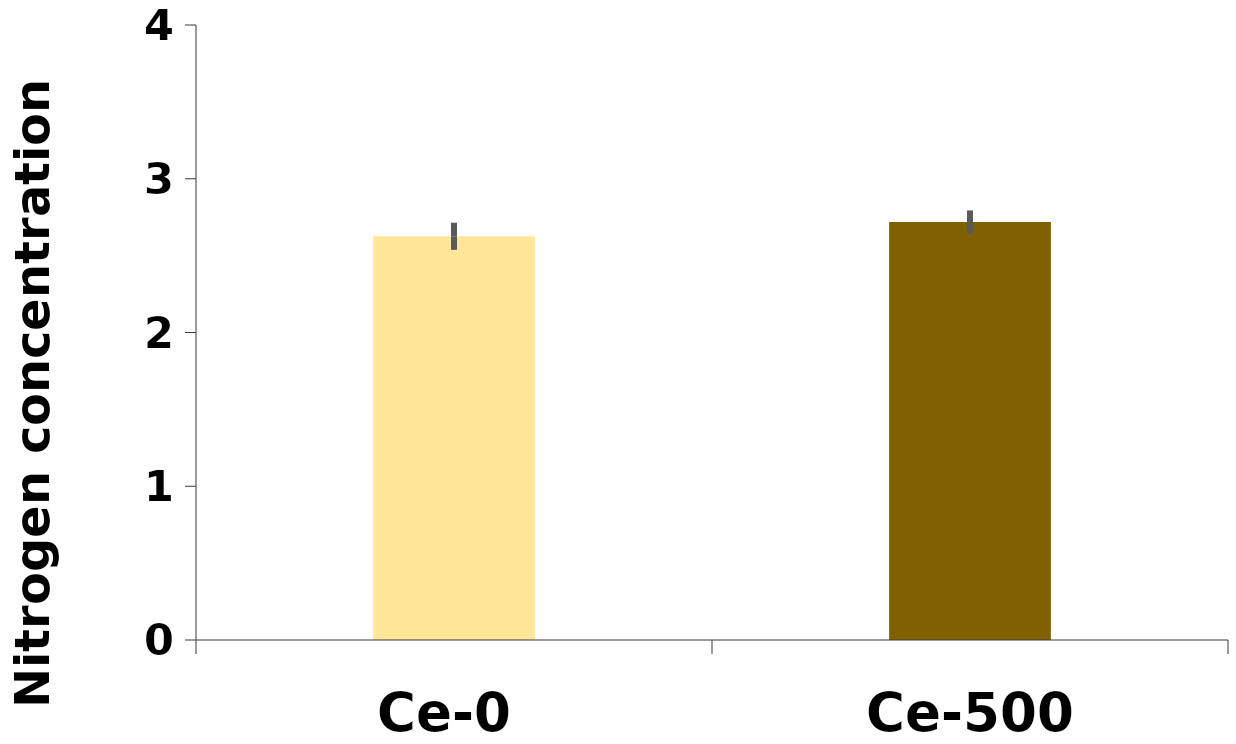
| Category | %N |
|---|---|
| Ce-0 | 2.626 |
| Ce-500 | 2.718 |